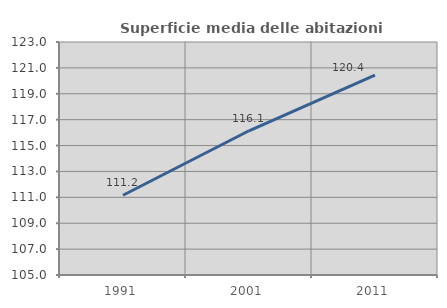
| Category | Superficie media delle abitazioni occupate |
|---|---|
| 1991.0 | 111.161 |
| 2001.0 | 116.143 |
| 2011.0 | 120.444 |